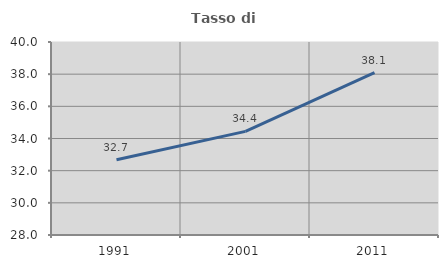
| Category | Tasso di occupazione   |
|---|---|
| 1991.0 | 32.673 |
| 2001.0 | 34.444 |
| 2011.0 | 38.095 |